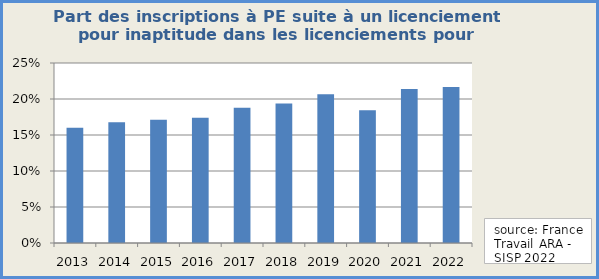
| Category | Part des inscriptions suite à un licenciement pour inaptitude dans les licenciements pour motif personnel |
|---|---|
| 2013.0 | 0.16 |
| 2014.0 | 0.168 |
| 2015.0 | 0.171 |
| 2016.0 | 0.174 |
| 2017.0 | 0.188 |
| 2018.0 | 0.194 |
| 2019.0 | 0.207 |
| 2020.0 | 0.184 |
| 2021.0 | 0.214 |
| 2022.0 | 0.217 |